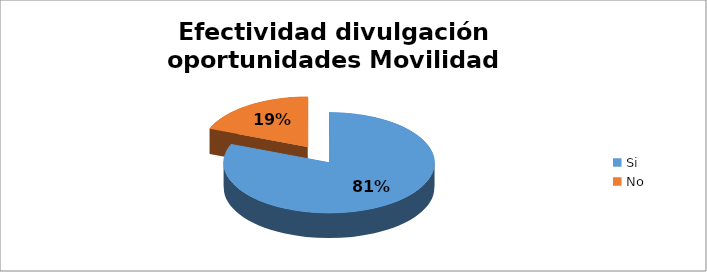
| Category | Porcentaje |
|---|---|
| Si | 0.81 |
| No | 0.19 |